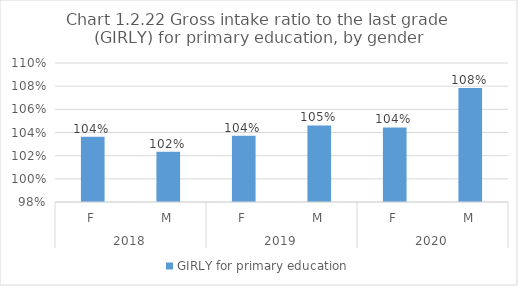
| Category | GIRLY for primary education |
|---|---|
| 0 | 1.036 |
| 1 | 1.023 |
| 2 | 1.037 |
| 3 | 1.046 |
| 4 | 1.044 |
| 5 | 1.078 |